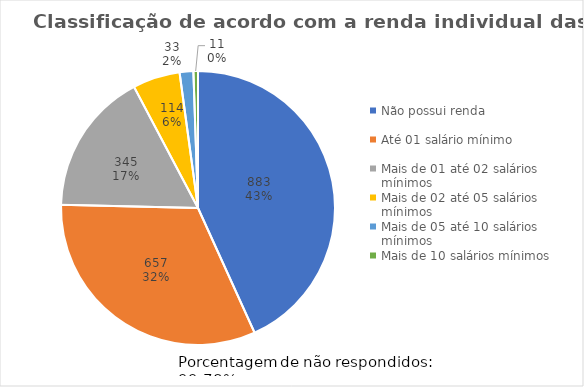
| Category | Series 0 |
|---|---|
| Não possui renda                    | 883 |
| Até 01 salário mínimo               | 657 |
| Mais de 01 até 02 salários mínimos  | 345 |
| Mais de 02 até 05 salários mínimos  | 114 |
| Mais de 05 até 10 salários mínimos  | 33 |
| Mais de 10 salários mínimos         | 11 |